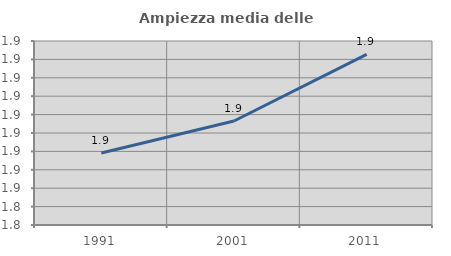
| Category | Ampiezza media delle famiglie |
|---|---|
| 1991.0 | 1.86 |
| 2001.0 | 1.868 |
| 2011.0 | 1.886 |